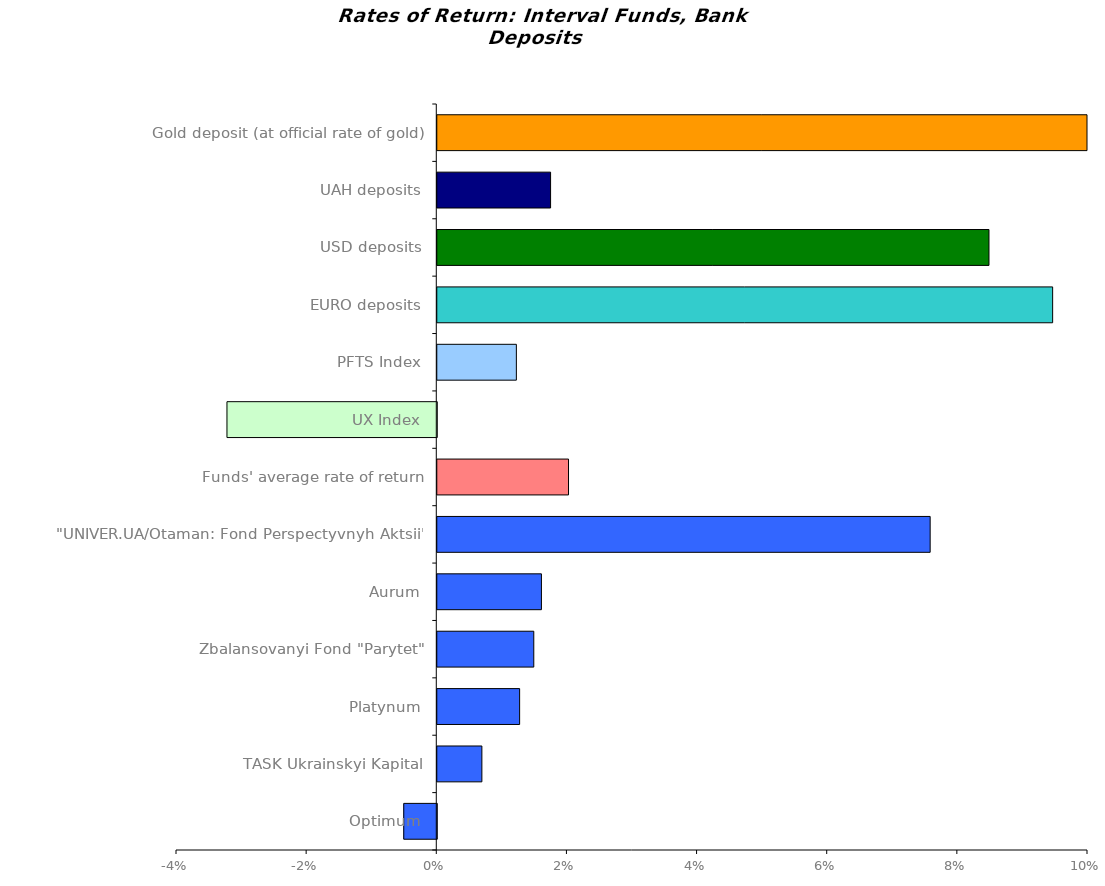
| Category | Series 0 |
|---|---|
| Optimum | -0.005 |
| TASK Ukrainskyi Kapital | 0.007 |
| Platynum | 0.013 |
| Zbalansovanyi Fond "Parytet" | 0.015 |
| Aurum | 0.016 |
| "UNIVER.UA/Otaman: Fond Perspectyvnyh Aktsii" | 0.076 |
| Funds' average rate of return | 0.02 |
| UX Index | -0.032 |
| PFTS Index | 0.012 |
| EURO deposits | 0.095 |
| USD deposits | 0.085 |
| UAH deposits | 0.017 |
| Gold deposit (at official rate of gold) | 0.191 |